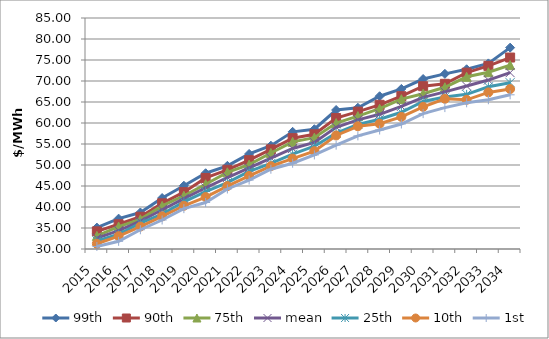
| Category | 99th | 90th | 75th | mean | 25th | 10th | 1st |
|---|---|---|---|---|---|---|---|
| 2015.0 | 35.095 | 34.202 | 33.112 | 32.598 | 31.946 | 31.249 | 30.609 |
| 2016.0 | 37.229 | 35.892 | 35.35 | 34.379 | 33.502 | 33.056 | 31.83 |
| 2017.0 | 38.687 | 37.683 | 37.066 | 36.616 | 36.187 | 35.336 | 34.582 |
| 2018.0 | 42.134 | 40.877 | 40.265 | 39.348 | 38.327 | 37.772 | 36.902 |
| 2019.0 | 45.069 | 43.531 | 42.674 | 41.981 | 41.236 | 40.294 | 39.609 |
| 2020.0 | 48.036 | 46.915 | 45.411 | 44.577 | 43.672 | 42.369 | 41.071 |
| 2021.0 | 49.801 | 48.859 | 48.255 | 47.021 | 45.81 | 44.985 | 44.292 |
| 2022.0 | 52.631 | 51.146 | 50.093 | 49.317 | 48.466 | 47.393 | 46.401 |
| 2023.0 | 54.599 | 53.725 | 52.868 | 51.654 | 50.376 | 49.722 | 48.993 |
| 2024.0 | 57.896 | 56.39 | 55.508 | 53.931 | 52.583 | 51.526 | 50.42 |
| 2025.0 | 58.521 | 57.307 | 56.513 | 55.361 | 54.464 | 53.294 | 52.398 |
| 2026.0 | 63.095 | 61.176 | 59.976 | 58.985 | 57.587 | 57.035 | 54.72 |
| 2027.0 | 63.627 | 62.711 | 61.633 | 60.74 | 59.659 | 59.219 | 56.937 |
| 2028.0 | 66.368 | 64.328 | 63.404 | 62.065 | 60.905 | 59.828 | 58.326 |
| 2029.0 | 68.121 | 66.383 | 65.679 | 63.947 | 62.562 | 61.452 | 59.763 |
| 2030.0 | 70.47 | 68.755 | 66.98 | 66.103 | 65.129 | 63.85 | 62.228 |
| 2031.0 | 71.702 | 69.329 | 68.504 | 67.404 | 66.212 | 65.764 | 63.666 |
| 2032.0 | 72.791 | 71.985 | 71.001 | 68.801 | 66.821 | 65.524 | 64.809 |
| 2033.0 | 74.19 | 73.598 | 72.081 | 70.223 | 68.622 | 67.285 | 65.54 |
| 2034.0 | 77.944 | 75.587 | 73.78 | 71.981 | 69.605 | 68.087 | 66.715 |